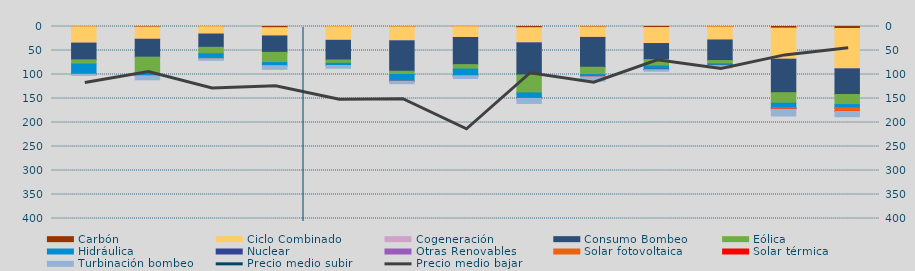
| Category | Carbón | Ciclo Combinado | Cogeneración | Consumo Bombeo | Eólica | Hidráulica | Nuclear | Otras Renovables | Solar fotovoltaica | Solar térmica | Turbinación bombeo |
|---|---|---|---|---|---|---|---|---|---|---|---|
| S | 432.5 | 33982.7 | 275.4 | 34800.5 | 8747.7 | 20855.2 | 39.1 | 0 | 120.5 | 16.9 | 2614.1 |
| O | 1070.2 | 25365.1 | 217.3 | 37208.4 | 34251.5 | 4376.1 | 0 | 0 | 112 | 4.5 | 8448.7 |
| N | 341.2 | 15370.8 | 69.7 | 27553.5 | 13534.1 | 10283 | 0 | 0 | 11.9 | 0 | 3198.9 |
| D | 2480.9 | 17195.4 | 77 | 34176.7 | 21256.4 | 6504.8 | 0 | 19.8 | 89.3 | 0 | 7509.1 |
| E | 386 | 28336.3 | 129.1 | 40939.4 | 6907.9 | 4462.9 | 34.4 | 0 | 32.7 | 0 | 5705.4 |
| F | 596.6 | 29112.7 | 204.1 | 63351.9 | 6588.8 | 14242.2 | 0 | 0 | 6.8 | 5.7 | 5009.4 |
| M | 303.5 | 22485.8 | 115.8 | 56511.7 | 9357.1 | 13652.7 | 0 | 45.9 | 36.9 | 12.5 | 5840.6 |
| A | 2494.9 | 31290.063 | 376.8 | 66847.891 | 37361.887 | 10548.549 | 58.3 | 29.1 | 101.167 | 483.9 | 10705.8 |
| M | 916.05 | 21695.666 | 176.35 | 62054.792 | 15250.739 | 4379.143 | 0 | 39.1 | 143.784 | 110.5 | 9070.525 |
| J | 2154.975 | 33372.05 | 35.5 | 33404.025 | 13344.6 | 6713.425 | 395.875 | 16.375 | 385.65 | 221.25 | 3231.725 |
| J | 780.225 | 27400.075 | 8 | 42750.35 | 6759.125 | 3263.775 | 115 | 0 | 90.1 | 206.65 | 4895.275 |
| A | 3351.92 | 64804.475 | 20.75 | 69703.55 | 22031.853 | 9149.525 | 70.975 | 22.5 | 2685.85 | 505.375 | 14186.525 |
| S | 4138.5 | 84055.788 | 26 | 53462.35 | 21071.172 | 6988.753 | 0 | 0.85 | 7069.199 | 219.625 | 10948.251 |